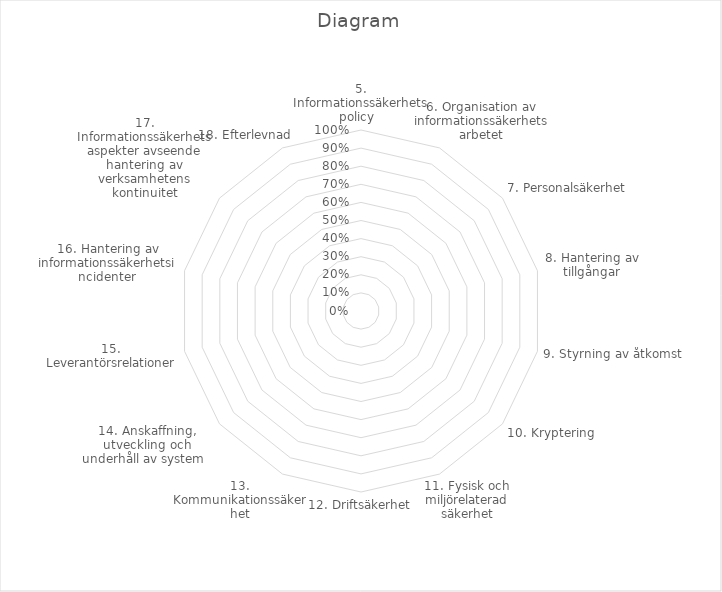
| Category | Series 0 |
|---|---|
| 5. Informationssäkerhetspolicy   | 0 |
| 6. Organisation av informationssäkerhetsarbetet | 0 |
| 7. Personalsäkerhet  | 0 |
| 8. Hantering av tillgångar | 0 |
| 9. Styrning av åtkomst  | 0 |
| 10. Kryptering  | 0 |
| 11. Fysisk och miljörelaterad säkerhet | 0 |
| 12. Driftsäkerhet | 0 |
| 13. Kommunikationssäkerhet | 0 |
| 14. Anskaffning, utveckling och underhåll av system   | 0 |
| 15. Leverantörsrelationer | 0 |
| 16. Hantering av informationssäkerhetsincidenter | 0 |
| 17. Informationssäkerhetsaspekter avseende hantering av verksamhetens kontinuitet | 0 |
| 18. Efterlevnad   | 0 |